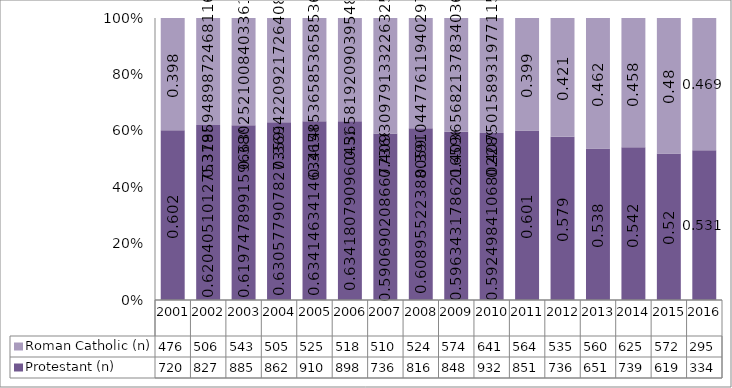
| Category | Protestant (n) | Roman Catholic (n) |
|---|---|---|
| 2001.0 | 720 | 476 |
| 2002.0 | 827 | 506 |
| 2003.0 | 885 | 543 |
| 2004.0 | 862 | 505 |
| 2005.0 | 910 | 525 |
| 2006.0 | 898 | 518 |
| 2007.0 | 736 | 510 |
| 2008.0 | 816 | 524 |
| 2009.0 | 848 | 574 |
| 2010.0 | 932 | 641 |
| 2011.0 | 851 | 564 |
| 2012.0 | 736 | 535 |
| 2013.0 | 651 | 560 |
| 2014.0 | 739 | 625 |
| 2015.0 | 619 | 572 |
| 2016.0 | 334 | 295 |